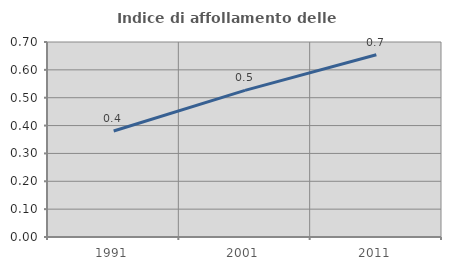
| Category | Indice di affollamento delle abitazioni  |
|---|---|
| 1991.0 | 0.381 |
| 2001.0 | 0.527 |
| 2011.0 | 0.654 |